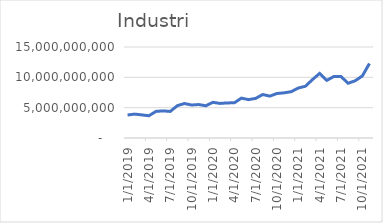
| Category | Industri |
|---|---|
| 1/1/19 | 3789650000 |
| 2/1/19 | 3938845833.333 |
| 3/1/19 | 3806656666.667 |
| 4/1/19 | 3667373333.333 |
| 5/1/19 | 4386640000 |
| 6/1/19 | 4472073333.333 |
| 7/1/19 | 4378144166.667 |
| 8/1/19 | 5329906666.667 |
| 9/1/19 | 5685479166.667 |
| 10/1/19 | 5435637500 |
| 11/1/19 | 5513387500 |
| 12/1/19 | 5313566666.667 |
| 1/1/20 | 5883516666.667 |
| 2/1/20 | 5697658333.333 |
| 3/1/20 | 5786815000 |
| 4/1/20 | 5793977500 |
| 5/1/20 | 6569490000 |
| 6/1/20 | 6325019166.667 |
| 7/1/20 | 6522194166.667 |
| 8/1/20 | 7167035833.333 |
| 9/1/20 | 6903419166.667 |
| 10/1/20 | 7338202500 |
| 11/1/20 | 7444169166.667 |
| 12/1/20 | 7633565000 |
| 1/1/21 | 8239619166.667 |
| 2/1/21 | 8534360833.333 |
| 3/1/21 | 9638394166.667 |
| 4/1/21 | 10646585833.333 |
| 5/1/21 | 9498435833.333 |
| 6/1/21 | 10136444166.667 |
| 7/1/21 | 10135665000 |
| 8/1/21 | 9024098333.333 |
| 9/1/21 | 9437344166.667 |
| 10/1/21 | 10229965000 |
| 11/1/21 | 12279698333.333 |